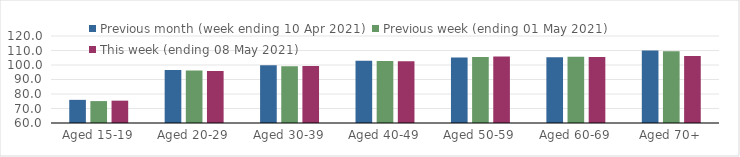
| Category | Previous month (week ending 10 Apr 2021) | Previous week (ending 01 May 2021) | This week (ending 08 May 2021) |
|---|---|---|---|
| Aged 15-19 | 75.96 | 75.11 | 75.41 |
| Aged 20-29 | 96.59 | 96.2 | 95.87 |
| Aged 30-39 | 99.76 | 99.17 | 99.27 |
| Aged 40-49 | 102.88 | 102.73 | 102.63 |
| Aged 50-59 | 105.11 | 105.58 | 105.8 |
| Aged 60-69 | 105.39 | 105.77 | 105.44 |
| Aged 70+ | 110 | 109.55 | 106.26 |